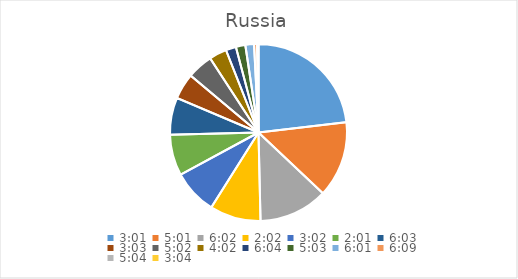
| Category | Series 0 |
|---|---|
| 0.12569444444444444 | 26.185 |
| 0.20902777777777778 | 15.709 |
| 0.2513888888888889 | 14.251 |
| 0.08472222222222221 | 10.537 |
| 0.12638888888888888 | 9.231 |
| 0.08402777777777777 | 8.475 |
| 0.2520833333333333 | 7.671 |
| 0.12708333333333333 | 5.346 |
| 0.20972222222222223 | 5.313 |
| 0.16805555555555554 | 3.635 |
| 0.25277777777777777 | 2.114 |
| 0.21041666666666667 | 1.956 |
| 0.25069444444444444 | 1.789 |
| 0.25625000000000003 | 0.608 |
| 0.2111111111111111 | 0.271 |
| 0.1277777777777778 | 0.03 |